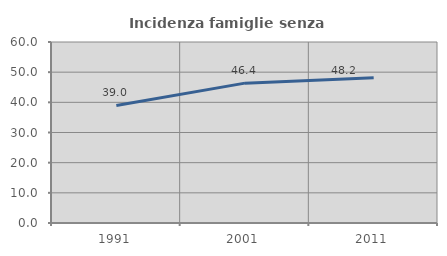
| Category | Incidenza famiglie senza nuclei |
|---|---|
| 1991.0 | 38.983 |
| 2001.0 | 46.364 |
| 2011.0 | 48.182 |